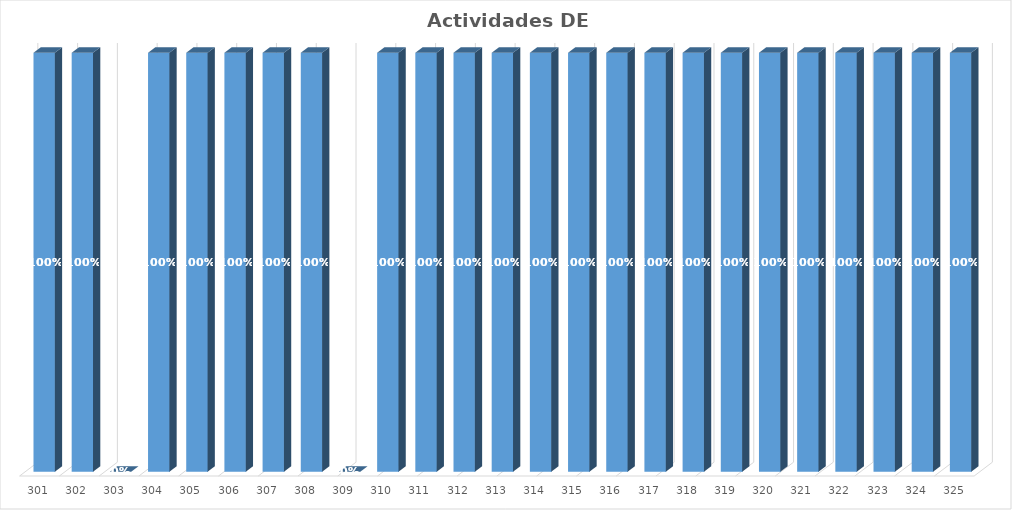
| Category | % Avance |
|---|---|
| 301.0 | 1 |
| 302.0 | 1 |
| 303.0 | 0 |
| 304.0 | 1 |
| 305.0 | 1 |
| 306.0 | 1 |
| 307.0 | 1 |
| 308.0 | 1 |
| 309.0 | 0 |
| 310.0 | 1 |
| 311.0 | 1 |
| 312.0 | 1 |
| 313.0 | 1 |
| 314.0 | 1 |
| 315.0 | 1 |
| 316.0 | 1 |
| 317.0 | 1 |
| 318.0 | 1 |
| 319.0 | 1 |
| 320.0 | 1 |
| 321.0 | 1 |
| 322.0 | 1 |
| 323.0 | 1 |
| 324.0 | 1 |
| 325.0 | 1 |